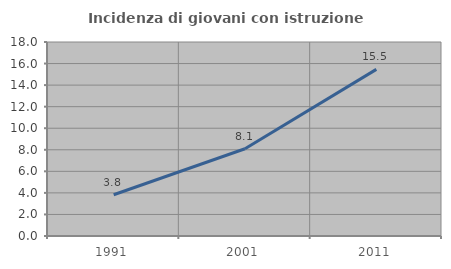
| Category | Incidenza di giovani con istruzione universitaria |
|---|---|
| 1991.0 | 3.828 |
| 2001.0 | 8.097 |
| 2011.0 | 15.459 |